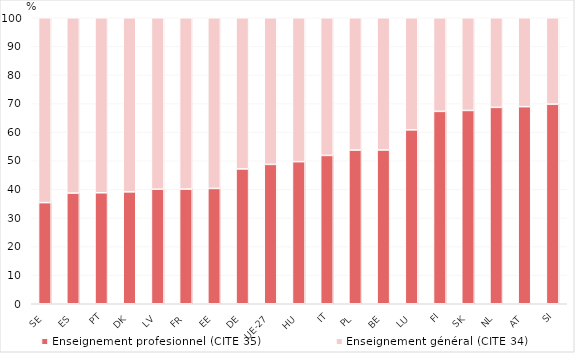
| Category | Enseignement profesionnel (CITE 35) | Enseignement général (CITE 34) |
|---|---|---|
| SE | 35.362 | 64.638 |
| ES | 38.699 | 61.301 |
| PT | 38.804 | 61.196 |
| DK | 39.128 | 60.872 |
| LV | 40.059 | 59.941 |
| FR | 40.101 | 59.899 |
| EE | 40.319 | 59.681 |
| DE | 47.156 | 52.844 |
| UE-27 | 48.728 | 51.272 |
| HU | 49.683 | 50.317 |
| IT | 51.865 | 48.135 |
| PL | 53.751 | 46.249 |
| BE | 53.791 | 46.209 |
| LU | 60.803 | 39.197 |
| FI | 67.264 | 32.736 |
| SK | 67.595 | 32.405 |
| NL | 68.673 | 31.327 |
| AT | 68.915 | 31.085 |
| SI | 69.811 | 30.189 |